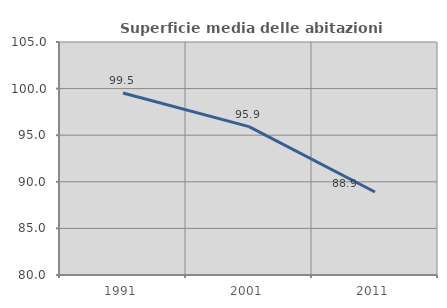
| Category | Superficie media delle abitazioni occupate |
|---|---|
| 1991.0 | 99.527 |
| 2001.0 | 95.923 |
| 2011.0 | 88.908 |